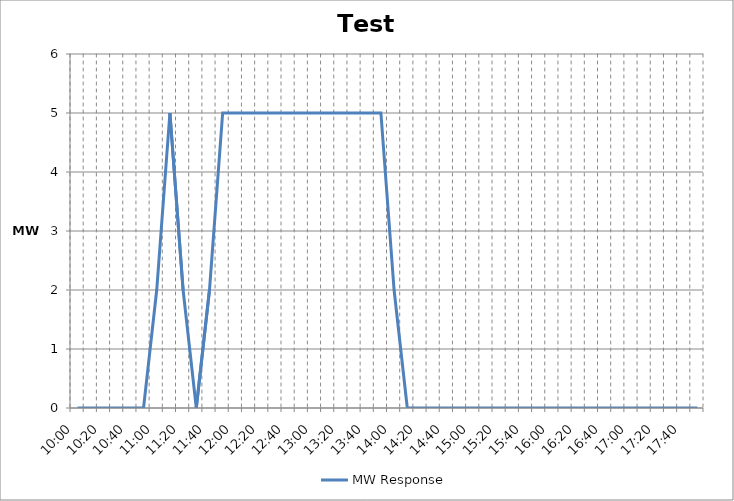
| Category | MW Response |
|---|---|
| 0.4166666666666667 | 0 |
| 0.4236111111111111 | 0 |
| 0.4305555555555556 | 0 |
| 0.4375 | 0 |
| 0.444444444444445 | 0 |
| 0.451388888888889 | 0 |
| 0.458333333333333 | 2 |
| 0.465277777777778 | 5 |
| 0.472222222222222 | 2 |
| 0.479166666666667 | 0 |
| 0.486111111111111 | 2 |
| 0.493055555555556 | 5 |
| 0.5 | 5 |
| 0.506944444444445 | 5 |
| 0.513888888888889 | 5 |
| 0.520833333333334 | 5 |
| 0.527777777777778 | 5 |
| 0.534722222222223 | 5 |
| 0.541666666666667 | 5 |
| 0.548611111111112 | 5 |
| 0.555555555555556 | 5 |
| 0.562500000000001 | 5 |
| 0.569444444444445 | 5 |
| 0.576388888888889 | 5 |
| 0.583333333333334 | 2 |
| 0.590277777777778 | 0 |
| 0.597222222222223 | 0 |
| 0.604166666666667 | 0 |
| 0.611111111111112 | 0 |
| 0.618055555555556 | 0 |
| 0.625000000000001 | 0 |
| 0.631944444444445 | 0 |
| 0.63888888888889 | 0 |
| 0.645833333333334 | 0 |
| 0.652777777777779 | 0 |
| 0.659722222222223 | 0 |
| 0.666666666666668 | 0 |
| 0.673611111111112 | 0 |
| 0.680555555555557 | 0 |
| 0.687500000000001 | 0 |
| 0.694444444444446 | 0 |
| 0.70138888888889 | 0 |
| 0.708333333333334 | 0 |
| 0.715277777777779 | 0 |
| 0.722222222222223 | 0 |
| 0.729166666666668 | 0 |
| 0.736111111111112 | 0 |
| 0.743055555555557 | 0 |